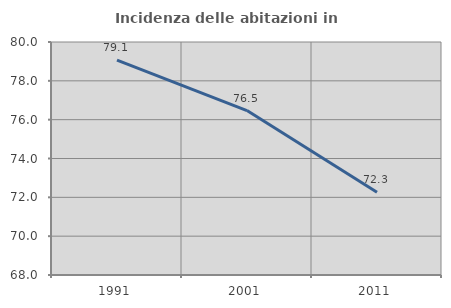
| Category | Incidenza delle abitazioni in proprietà  |
|---|---|
| 1991.0 | 79.061 |
| 2001.0 | 76.471 |
| 2011.0 | 72.26 |